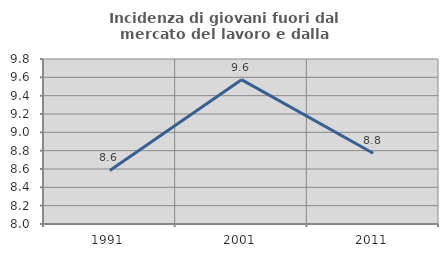
| Category | Incidenza di giovani fuori dal mercato del lavoro e dalla formazione  |
|---|---|
| 1991.0 | 8.584 |
| 2001.0 | 9.574 |
| 2011.0 | 8.772 |